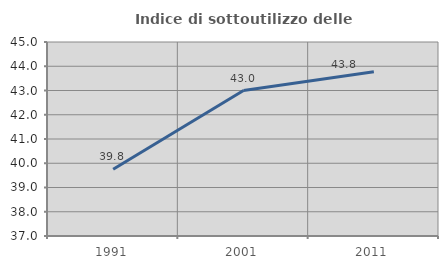
| Category | Indice di sottoutilizzo delle abitazioni  |
|---|---|
| 1991.0 | 39.754 |
| 2001.0 | 42.997 |
| 2011.0 | 43.772 |